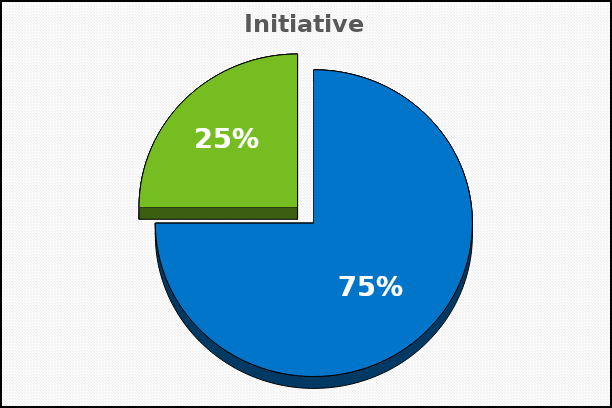
| Category | Series 0 |
|---|---|
| 0 | 25000 |
| 1 | 8333.333 |